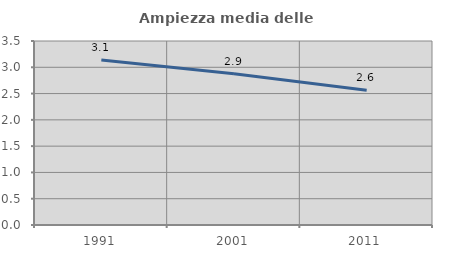
| Category | Ampiezza media delle famiglie |
|---|---|
| 1991.0 | 3.14 |
| 2001.0 | 2.875 |
| 2011.0 | 2.562 |